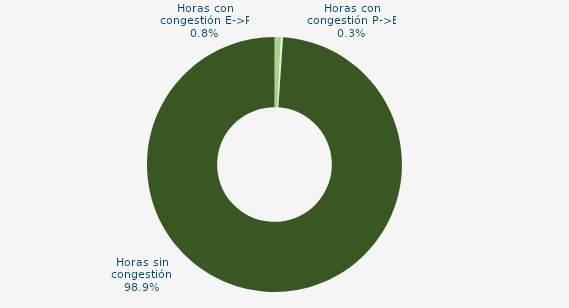
| Category | Horas con congestión E->P |
|---|---|
| Horas con congestión E->P | 0.805 |
| Horas con congestión P->E | 0.268 |
| Horas sin congestión | 98.926 |